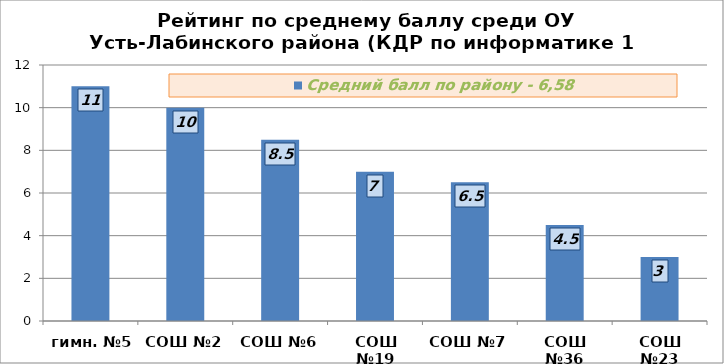
| Category | Средний балл по району - 6,58 |
|---|---|
| гимн. №5 | 11 |
| СОШ №2 | 10 |
| СОШ №6 | 8.5 |
| СОШ №19 | 7 |
| СОШ №7 | 6.5 |
| СОШ №36 | 4.5 |
| СОШ №23 | 3 |